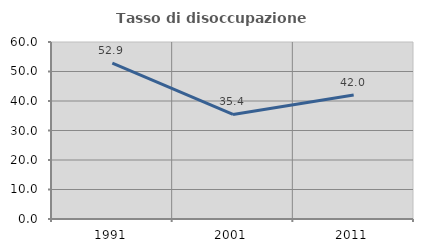
| Category | Tasso di disoccupazione giovanile  |
|---|---|
| 1991.0 | 52.88 |
| 2001.0 | 35.433 |
| 2011.0 | 42.017 |